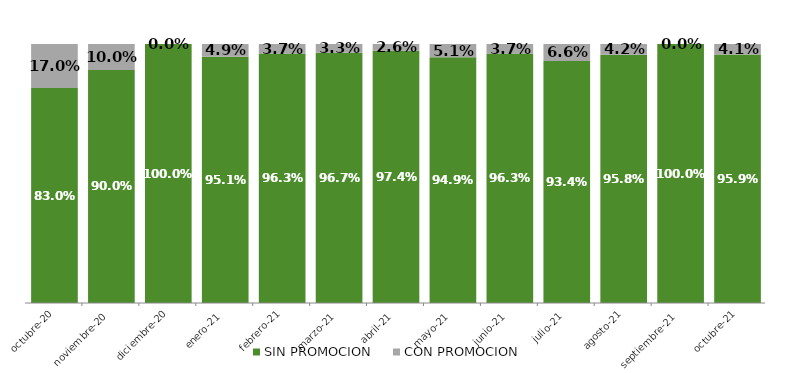
| Category | SIN PROMOCION   | CON PROMOCION   |
|---|---|---|
| 2020-10-01 | 0.83 | 0.17 |
| 2020-11-01 | 0.9 | 0.1 |
| 2020-12-01 | 1 | 0 |
| 2021-01-01 | 0.951 | 0.049 |
| 2021-02-01 | 0.963 | 0.037 |
| 2021-03-01 | 0.967 | 0.033 |
| 2021-04-01 | 0.974 | 0.026 |
| 2021-05-01 | 0.949 | 0.051 |
| 2021-06-01 | 0.963 | 0.037 |
| 2021-07-01 | 0.934 | 0.066 |
| 2021-08-01 | 0.958 | 0.042 |
| 2021-09-01 | 1 | 0 |
| 2021-10-01 | 0.959 | 0.041 |